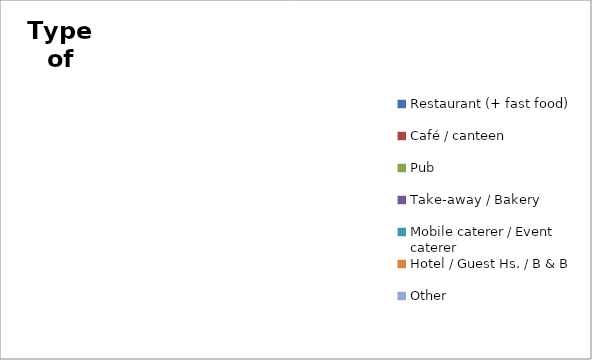
| Category | Series 0 |
|---|---|
| Restaurant (+ fast food) | 0 |
| Café / canteen | 0 |
| Pub | 0 |
| Take-away / Bakery | 0 |
| Mobile caterer / Event caterer | 0 |
| Hotel / Guest Hs. / B & B | 0 |
| Other | 0 |